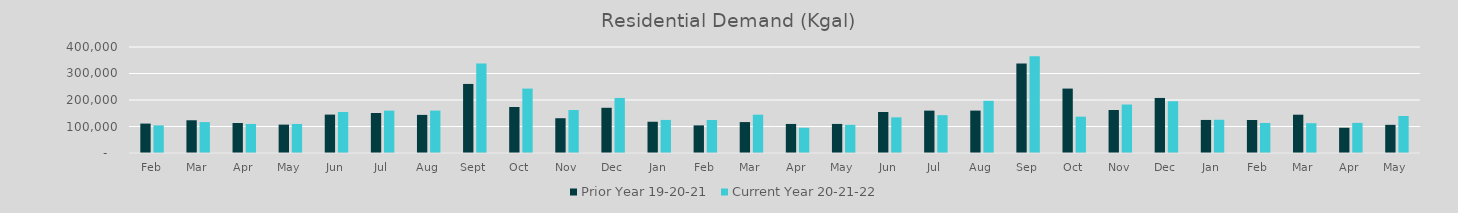
| Category | Prior Year 19-20-21 | Current Year 20-21-22 |
|---|---|---|
| Feb | 111009.962 | 104204.224 |
| Mar | 123525.131 | 116687.491 |
| Apr | 113258.787 | 109598.965 |
| May | 107128.051 | 109656.015 |
| Jun | 144930.453 | 154696.236 |
| Jul | 151028.014 | 159889.353 |
| Aug | 143816.337 | 160013.985 |
| Sep | 260607.456 | 337995.641 |
| Oct | 173601.368 | 243049.084 |
| Nov | 131198.833 | 162175.563 |
| Dec | 170629.384 | 207737.904 |
| Jan | 117899.625 | 124779.797 |
| Feb | 104204.224 | 124538.238 |
| Mar | 116687.491 | 144510.137 |
| Apr | 109598.965 | 95313.825 |
| May | 109656.015 | 106271.913 |
| Jun | 154696.236 | 134556.172 |
| Jul | 159889.353 | 142779.003 |
| Aug | 160013.985 | 196888.231 |
| Sep | 337995.641 | 364911.478 |
| Oct | 243049.084 | 137121.969 |
| Nov | 162175.563 | 182996.966 |
| Dec | 207737.904 | 195285.925 |
| Jan | 124779.797 | 125449.092 |
| Feb | 124538.238 | 113415.44 |
| Mar | 144510.137 | 112550.393 |
| Apr | 95313.825 | 113675.535 |
| May | 106271.913 | 139571.108 |